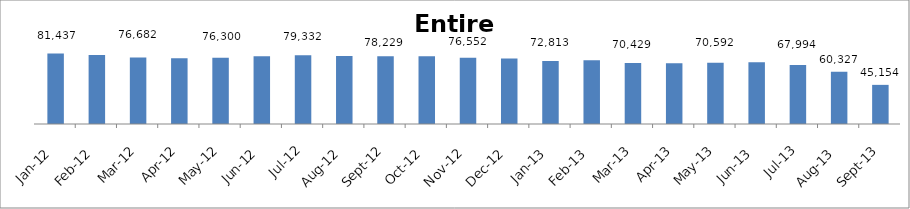
| Category | Inactive Premise with UKU |
|---|---|
| 2012-01-01 | 81437 |
| 2012-02-01 | 79474 |
| 2012-03-01 | 76682 |
| 2012-04-01 | 75935 |
| 2012-05-01 | 76300 |
| 2012-06-01 | 78068 |
| 2012-07-01 | 79332 |
| 2012-08-01 | 78321 |
| 2012-09-01 | 78229 |
| 2012-10-01 | 78108 |
| 2012-11-01 | 76552 |
| 2012-12-01 | 75633 |
| 2013-01-01 | 72813 |
| 2013-02-01 | 73438 |
| 2013-03-01 | 70429 |
| 2013-04-01 | 70094 |
| 2013-05-01 | 70592 |
| 2013-06-01 | 71343 |
| 2013-07-01 | 67994 |
| 2013-08-01 | 60327 |
| 2013-09-01 | 45154 |